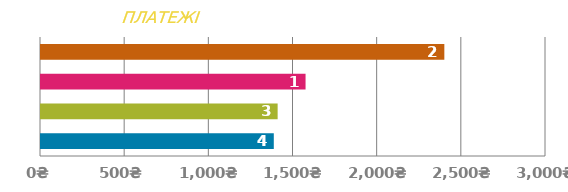
| Category | ПЛАТІЖ |
|---|---|
| 0 | 1382.921 |
| 1 | 1405.775 |
| 2 | 1571.655 |
| 3 | 2396.046 |